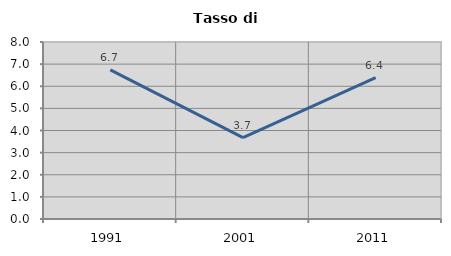
| Category | Tasso di disoccupazione   |
|---|---|
| 1991.0 | 6.736 |
| 2001.0 | 3.676 |
| 2011.0 | 6.388 |